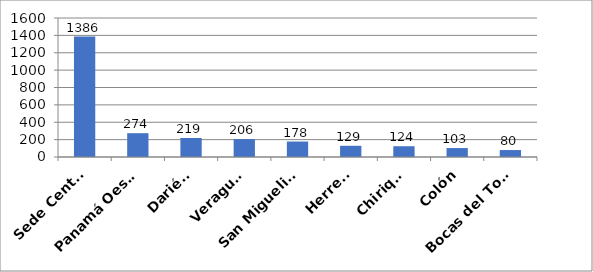
| Category | Series 0 |
|---|---|
| Sede Central | 1386 |
| Panamá Oeste  | 274 |
| Darién  | 219 |
| Veraguas | 206 |
| San Miguelito  | 178 |
| Herrera | 129 |
| Chiriquí | 124 |
| Colón | 103 |
| Bocas del Toro  | 80 |